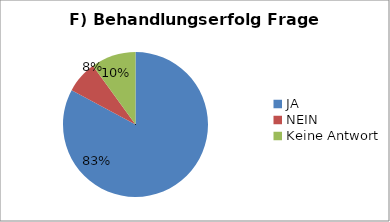
| Category | Series 0 |
|---|---|
| JA | 58 |
| NEIN | 5 |
| Keine Antwort | 7 |